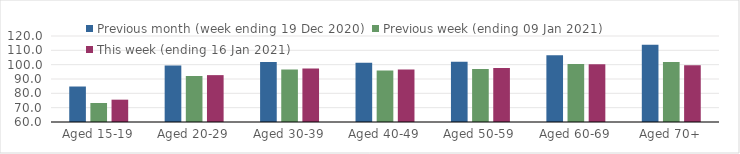
| Category | Previous month (week ending 19 Dec 2020) | Previous week (ending 09 Jan 2021) | This week (ending 16 Jan 2021) |
|---|---|---|---|
| Aged 15-19 | 84.76 | 73.26 | 75.58 |
| Aged 20-29 | 99.43 | 92.1 | 92.7 |
| Aged 30-39 | 101.94 | 96.67 | 97.35 |
| Aged 40-49 | 101.28 | 95.85 | 96.6 |
| Aged 50-59 | 102.1 | 97.02 | 97.75 |
| Aged 60-69 | 106.54 | 100.49 | 100.32 |
| Aged 70+ | 113.91 | 101.86 | 99.51 |